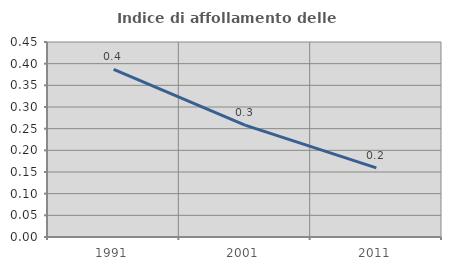
| Category | Indice di affollamento delle abitazioni  |
|---|---|
| 1991.0 | 0.387 |
| 2001.0 | 0.258 |
| 2011.0 | 0.159 |